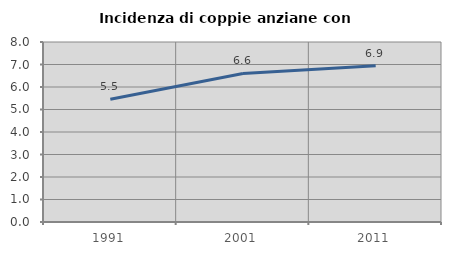
| Category | Incidenza di coppie anziane con figli |
|---|---|
| 1991.0 | 5.455 |
| 2001.0 | 6.602 |
| 2011.0 | 6.941 |